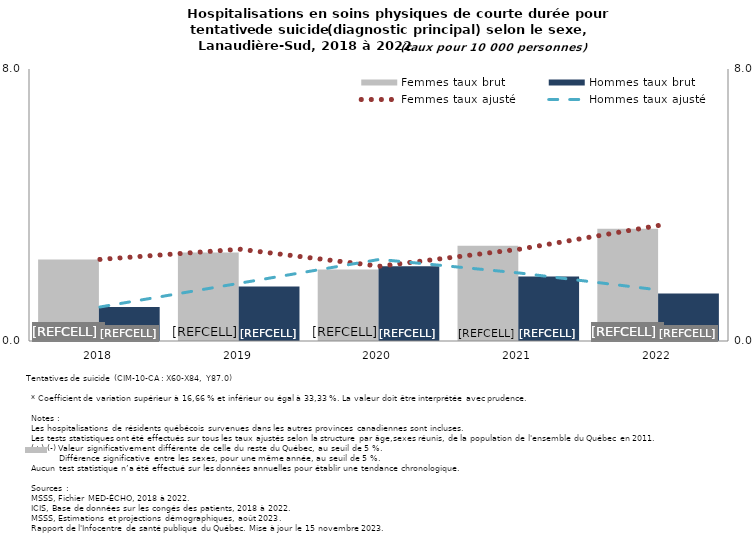
| Category | Femmes taux brut | Hommes taux brut |
|---|---|---|
| 2018.0 | 2.4 | 1 |
| 2019.0 | 2.6 | 1.6 |
| 2020.0 | 2.1 | 2.2 |
| 2021.0 | 2.8 | 1.9 |
| 2022.0 | 3.3 | 1.4 |